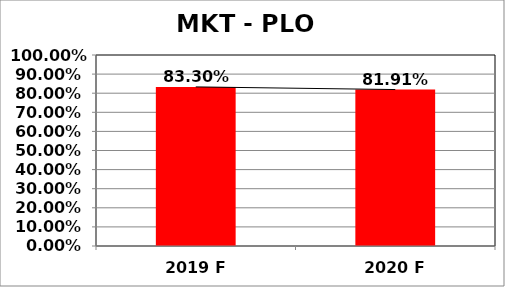
| Category | Series 0 |
|---|---|
| 2019 F | 0.833 |
| 2020 F | 0.819 |